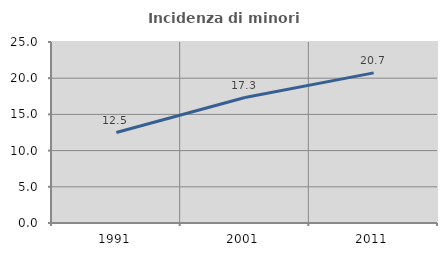
| Category | Incidenza di minori stranieri |
|---|---|
| 1991.0 | 12.5 |
| 2001.0 | 17.333 |
| 2011.0 | 20.737 |